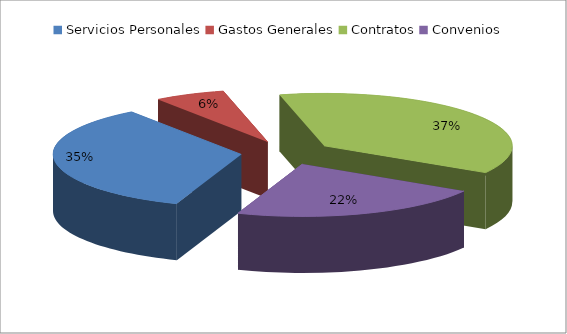
| Category | Series 0 |
|---|---|
| Servicios Personales | 208033762.893 |
| Gastos Generales | 36783235 |
| Contratos | 225000000 |
| Convenios | 132402412 |